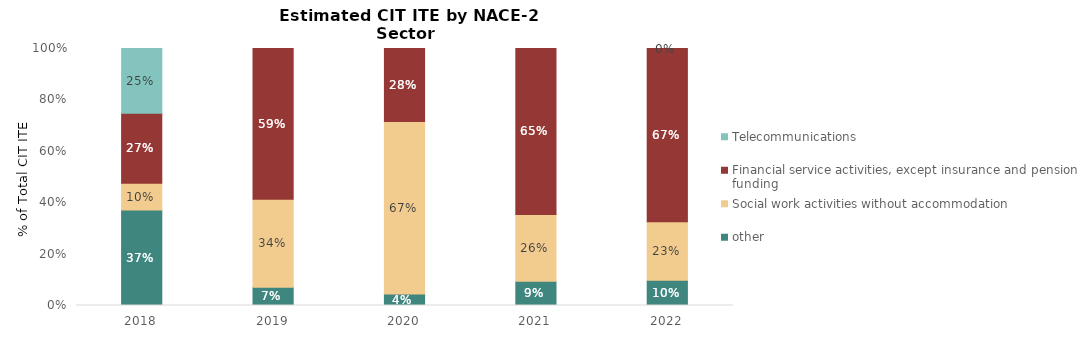
| Category | other | Social work activities without accommodation  | Financial service activities, except insurance and pension funding  | Telecommunications |
|---|---|---|---|---|
| 2018.0 | 0.371 | 0.104 | 0.273 | 0.252 |
| 2019.0 | 0.071 | 0.342 | 0.587 | 0 |
| 2020.0 | 0.045 | 0.671 | 0.284 | 0 |
| 2021.0 | 0.094 | 0.261 | 0.646 | 0 |
| 2022.0 | 0.098 | 0.228 | 0.674 | 0 |